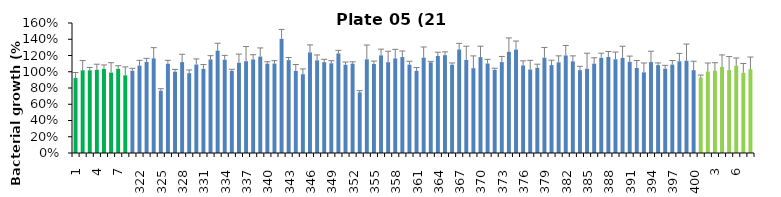
| Category | 21 h % |
|---|---|
| 1.0 | 0.924 |
| 2.0 | 1.018 |
| 3.0 | 1.018 |
| 4.0 | 1.024 |
| 5.0 | 1.035 |
| 6.0 | 0.989 |
| 7.0 | 1.036 |
| 8.0 | 0.956 |
| 321.0 | 1.013 |
| 322.0 | 1.076 |
| 323.0 | 1.121 |
| 324.0 | 1.165 |
| 325.0 | 0.766 |
| 326.0 | 1.098 |
| 327.0 | 1 |
| 328.0 | 1.119 |
| 329.0 | 0.983 |
| 330.0 | 1.088 |
| 331.0 | 1.036 |
| 332.0 | 1.151 |
| 333.0 | 1.26 |
| 334.0 | 1.148 |
| 335.0 | 1.011 |
| 336.0 | 1.111 |
| 337.0 | 1.13 |
| 338.0 | 1.151 |
| 339.0 | 1.186 |
| 340.0 | 1.099 |
| 341.0 | 1.101 |
| 342.0 | 1.405 |
| 343.0 | 1.143 |
| 344.0 | 1.01 |
| 345.0 | 0.969 |
| 346.0 | 1.237 |
| 347.0 | 1.141 |
| 348.0 | 1.117 |
| 349.0 | 1.104 |
| 350.0 | 1.226 |
| 351.0 | 1.086 |
| 352.0 | 1.1 |
| 353.0 | 0.747 |
| 354.0 | 1.153 |
| 355.0 | 1.095 |
| 356.0 | 1.201 |
| 357.0 | 1.118 |
| 358.0 | 1.164 |
| 359.0 | 1.181 |
| 360.0 | 1.087 |
| 361.0 | 1.012 |
| 362.0 | 1.173 |
| 363.0 | 1.116 |
| 364.0 | 1.195 |
| 365.0 | 1.204 |
| 366.0 | 1.086 |
| 367.0 | 1.274 |
| 368.0 | 1.145 |
| 369.0 | 1.044 |
| 370.0 | 1.18 |
| 371.0 | 1.101 |
| 372.0 | 1.023 |
| 373.0 | 1.119 |
| 374.0 | 1.246 |
| 375.0 | 1.273 |
| 376.0 | 1.078 |
| 377.0 | 1.028 |
| 378.0 | 1.048 |
| 379.0 | 1.173 |
| 380.0 | 1.082 |
| 381.0 | 1.115 |
| 382.0 | 1.2 |
| 383.0 | 1.128 |
| 384.0 | 1.019 |
| 385.0 | 1.036 |
| 386.0 | 1.099 |
| 387.0 | 1.171 |
| 388.0 | 1.182 |
| 389.0 | 1.154 |
| 390.0 | 1.17 |
| 391.0 | 1.122 |
| 392.0 | 1.047 |
| 393.0 | 0.993 |
| 394.0 | 1.119 |
| 395.0 | 1.082 |
| 396.0 | 1.038 |
| 397.0 | 1.088 |
| 398.0 | 1.129 |
| 399.0 | 1.135 |
| 400.0 | 1.019 |
| 1.0 | 0.931 |
| 2.0 | 1.003 |
| 3.0 | 1.013 |
| 4.0 | 1.059 |
| 5.0 | 1.02 |
| 6.0 | 1.074 |
| 7.0 | 0.987 |
| 8.0 | 1.032 |